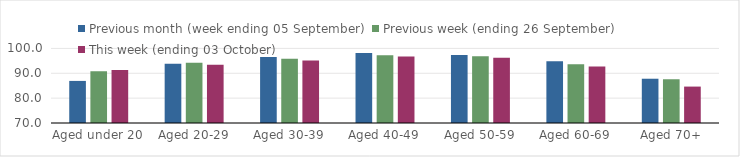
| Category | Previous month (week ending 05 September) | Previous week (ending 26 September) | This week (ending 03 October) |
|---|---|---|---|
| Aged under 20 | 86.93 | 90.81 | 91.32 |
| Aged 20-29 | 93.8 | 94.22 | 93.45 |
| Aged 30-39 | 96.6 | 95.8 | 95.16 |
| Aged 40-49 | 98.18 | 97.24 | 96.71 |
| Aged 50-59 | 97.34 | 96.89 | 96.24 |
| Aged 60-69 | 94.88 | 93.6 | 92.76 |
| Aged 70+ | 87.81 | 87.6 | 84.65 |